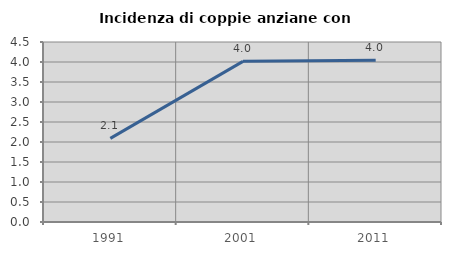
| Category | Incidenza di coppie anziane con figli |
|---|---|
| 1991.0 | 2.092 |
| 2001.0 | 4.016 |
| 2011.0 | 4.042 |